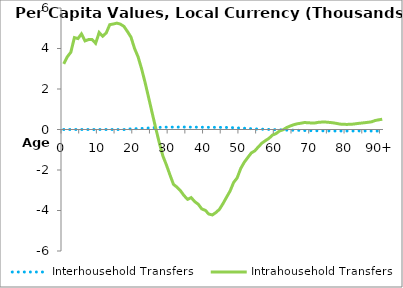
| Category | Interhousehold Transfers | Intrahousehold Transfers |
|---|---|---|
| 0 | 0 | 3240.183 |
|  | 0 | 3589.114 |
| 2 | 0 | 3817.072 |
| 3 | 0 | 4538.881 |
| 4 | 0 | 4490.077 |
| 5 | 0 | 4721.441 |
| 6 | 0 | 4375.781 |
| 7 | 0 | 4441.336 |
| 8 | 0 | 4440.087 |
| 9 | 0 | 4258.947 |
| 10 | 0 | 4789.084 |
| 11 | -0.001 | 4606.754 |
| 12 | -0.008 | 4768.53 |
| 13 | -0.045 | 5178.155 |
| 14 | -0.098 | 5208.335 |
| 15 | -0.967 | 5252.631 |
| 16 | -1.931 | 5203.595 |
| 17 | -3.044 | 5091.193 |
| 18 | 26.507 | 4837.869 |
| 19 | 30.468 | 4558.506 |
| 20 | 35.709 | 4003.137 |
| 21 | 44.173 | 3587.302 |
| 22 | 52.293 | 2993.437 |
| 23 | 62.017 | 2307.649 |
| 24 | 72.887 | 1563.227 |
| 25 | 84.606 | 803.028 |
| 26 | 95.204 | 56.881 |
| 27 | 104.125 | -658.559 |
| 28 | 110.876 | -1301.545 |
| 29 | 115.529 | -1747.221 |
| 30 | 116.775 | -2235.925 |
| 31 | 117.753 | -2707.653 |
| 32 | 118.659 | -2848.604 |
| 33 | 119.979 | -3028.513 |
| 34 | 120.065 | -3267.457 |
| 35 | 118.259 | -3448.412 |
| 36 | 117.226 | -3362.128 |
| 37 | 115.223 | -3559.679 |
| 38 | 112.435 | -3689.993 |
| 39 | 109.768 | -3921.515 |
| 40 | 108.191 | -3992.495 |
| 41 | 106.717 | -4176.311 |
| 42 | 106.259 | -4218.924 |
| 43 | 105.901 | -4099.907 |
| 44 | 105.252 | -3940.975 |
| 45 | 104.758 | -3659.19 |
| 46 | 102.128 | -3345.823 |
| 47 | 96.229 | -3039.753 |
| 48 | 88.01 | -2616.813 |
| 49 | 79.094 | -2390.187 |
| 50 | 70.451 | -1927.848 |
| 51 | 61.953 | -1620.493 |
| 52 | 52.181 | -1384.896 |
| 53 | 40.184 | -1159.024 |
| 54 | 29.202 | -1053.426 |
| 55 | 22.411 | -856.202 |
| 56 | 15.688 | -673.627 |
| 57 | 10.767 | -547.935 |
| 58 | 4.884 | -435.601 |
| 59 | -2.451 | -273.017 |
| 60 | -9.68 | -201.349 |
| 61 | -16.11 | -70.906 |
| 62 | -23.459 | -13.948 |
| 63 | -30.04 | 98.258 |
| 64 | -31.393 | 172.109 |
| 65 | -33.466 | 236.7 |
| 66 | -37.583 | 282.801 |
| 67 | -43.947 | 309.58 |
| 68 | -50.757 | 345.118 |
| 69 | -54.27 | 333.36 |
| 70 | -57.291 | 322.418 |
| 71 | -60.063 | 323.139 |
| 72 | -62.881 | 355.767 |
| 73 | -65.295 | 366.378 |
| 74 | -67.209 | 366.803 |
| 75 | -69.158 | 351.313 |
| 76 | -70.751 | 332.293 |
| 77 | -71.763 | 304.497 |
| 78 | -72.106 | 268.459 |
| 79 | -72.037 | 254.915 |
| 80 | -71.857 | 252.195 |
| 81 | -71.178 | 255.116 |
| 82 | -71.229 | 270.635 |
| 83 | -70.896 | 295.746 |
| 84 | -71.038 | 314.533 |
| 85 | -71.514 | 334.592 |
| 86 | -72.097 | 356.072 |
| 87 | -72.751 | 379.167 |
| 88 | -73.442 | 444.007 |
| 89 | -74.144 | 477.082 |
| 90+ | -74.99 | 507.198 |